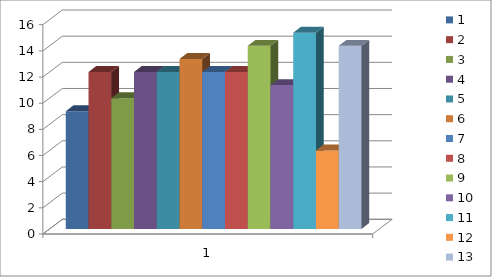
| Category | 1 | 2 | 3 | 4 | 5 | 6 | 7 | 8 | 9 | 10 | 11 | 12 | 13 |
|---|---|---|---|---|---|---|---|---|---|---|---|---|---|
| 0 | 9 | 12 | 10 | 12 | 12 | 13 | 12 | 12 | 14 | 11 | 15 | 6 | 14 |